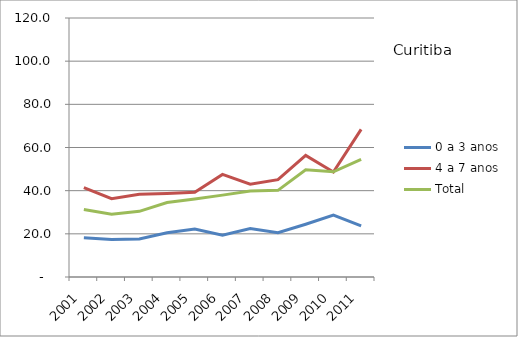
| Category | 0 a 3 anos | 4 a 7 anos | Total |
|---|---|---|---|
| 2001.0 | 18.24 | 41.43 | 31.25 |
| 2002.0 | 17.38 | 36.29 | 29.13 |
| 2003.0 | 17.6 | 38.34 | 30.42 |
| 2004.0 | 20.46 | 38.66 | 34.53 |
| 2005.0 | 22.2 | 39.23 | 36.1 |
| 2006.0 | 19.31 | 47.54 | 37.93 |
| 2007.0 | 22.49 | 43.03 | 39.86 |
| 2008.0 | 20.51 | 45.12 | 40.14 |
| 2009.0 | 24.45 | 56.36 | 49.67 |
| 2010.0 | 28.69 | 48.63 | 48.74 |
| 2011.0 | 23.73 | 68.37 | 54.51 |